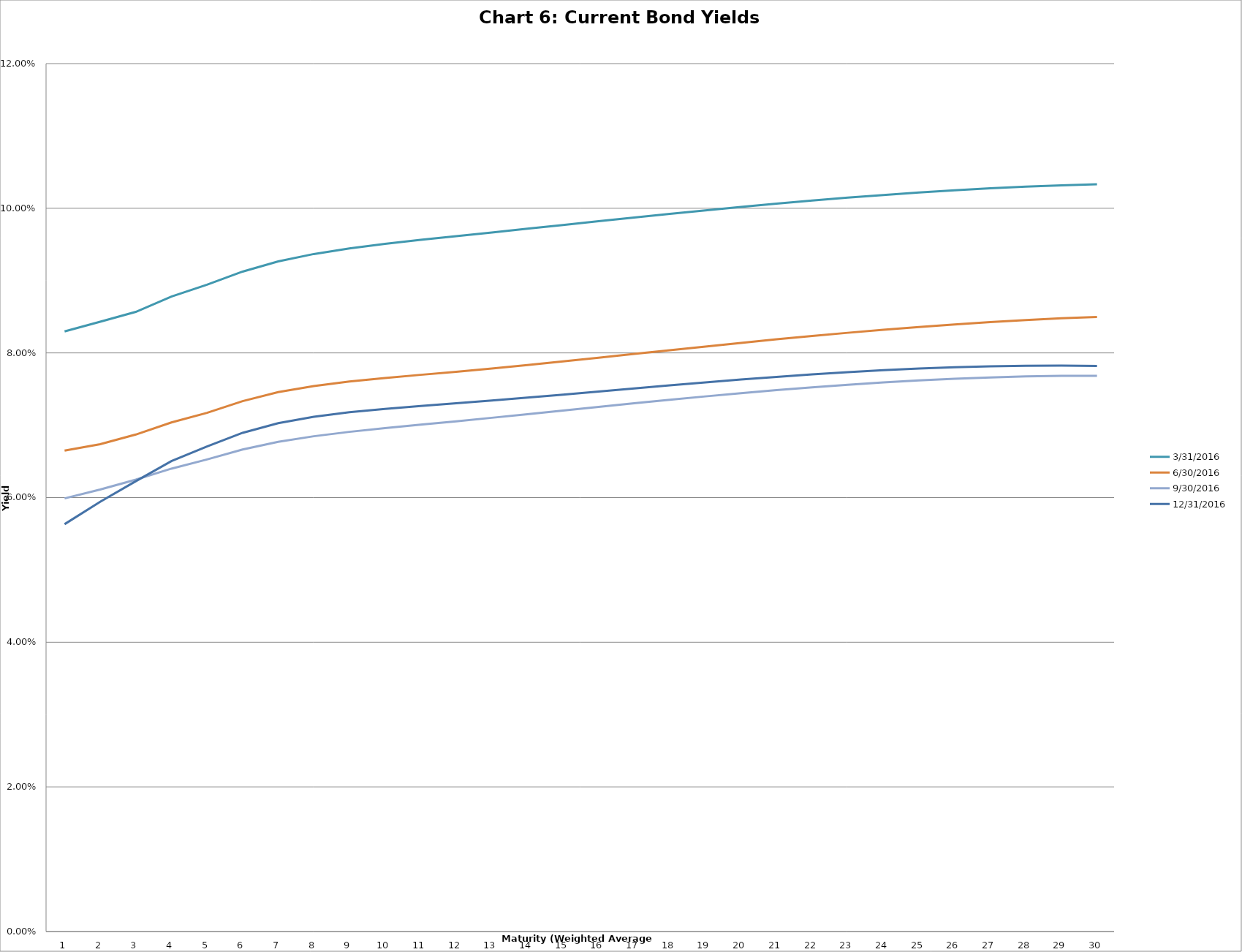
| Category | 3/31/2016 | 6/30/2016 | 9/30/2016 | 12/31/2016 |
|---|---|---|---|---|
| 0 | 0.083 | 0.067 | 0.06 | 0.056 |
| 1 | 0.084 | 0.067 | 0.061 | 0.059 |
| 2 | 0.086 | 0.069 | 0.062 | 0.062 |
| 3 | 0.088 | 0.07 | 0.064 | 0.065 |
| 4 | 0.089 | 0.072 | 0.065 | 0.067 |
| 5 | 0.091 | 0.073 | 0.067 | 0.069 |
| 6 | 0.093 | 0.075 | 0.068 | 0.07 |
| 7 | 0.094 | 0.075 | 0.068 | 0.071 |
| 8 | 0.094 | 0.076 | 0.069 | 0.072 |
| 9 | 0.095 | 0.077 | 0.07 | 0.072 |
| 10 | 0.096 | 0.077 | 0.07 | 0.073 |
| 11 | 0.096 | 0.077 | 0.071 | 0.073 |
| 12 | 0.097 | 0.078 | 0.071 | 0.073 |
| 13 | 0.097 | 0.078 | 0.072 | 0.074 |
| 14 | 0.098 | 0.079 | 0.072 | 0.074 |
| 15 | 0.098 | 0.079 | 0.073 | 0.075 |
| 16 | 0.099 | 0.08 | 0.073 | 0.075 |
| 17 | 0.099 | 0.08 | 0.074 | 0.076 |
| 18 | 0.1 | 0.081 | 0.074 | 0.076 |
| 19 | 0.1 | 0.081 | 0.074 | 0.076 |
| 20 | 0.101 | 0.082 | 0.075 | 0.077 |
| 21 | 0.101 | 0.082 | 0.075 | 0.077 |
| 22 | 0.101 | 0.083 | 0.076 | 0.077 |
| 23 | 0.102 | 0.083 | 0.076 | 0.078 |
| 24 | 0.102 | 0.084 | 0.076 | 0.078 |
| 25 | 0.102 | 0.084 | 0.076 | 0.078 |
| 26 | 0.103 | 0.084 | 0.077 | 0.078 |
| 27 | 0.103 | 0.085 | 0.077 | 0.078 |
| 28 | 0.103 | 0.085 | 0.077 | 0.078 |
| 29 | 0.103 | 0.085 | 0.077 | 0.078 |